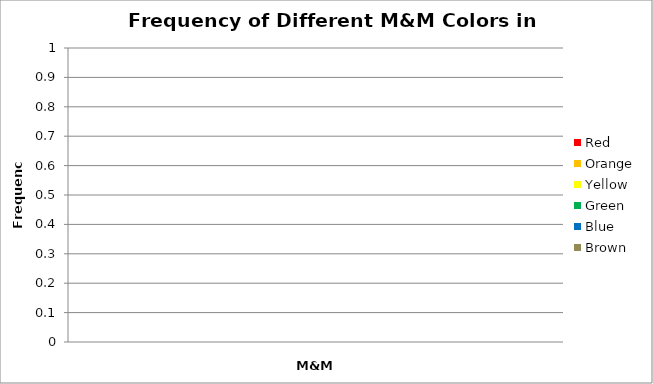
| Category | Red | Orange | Yellow | Green | Blue | Brown |
|---|---|---|---|---|---|---|
| Group Total | 0 | 0 | 0 | 0 | 0 | 0 |